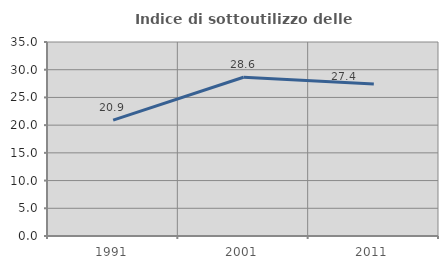
| Category | Indice di sottoutilizzo delle abitazioni  |
|---|---|
| 1991.0 | 20.899 |
| 2001.0 | 28.647 |
| 2011.0 | 27.426 |